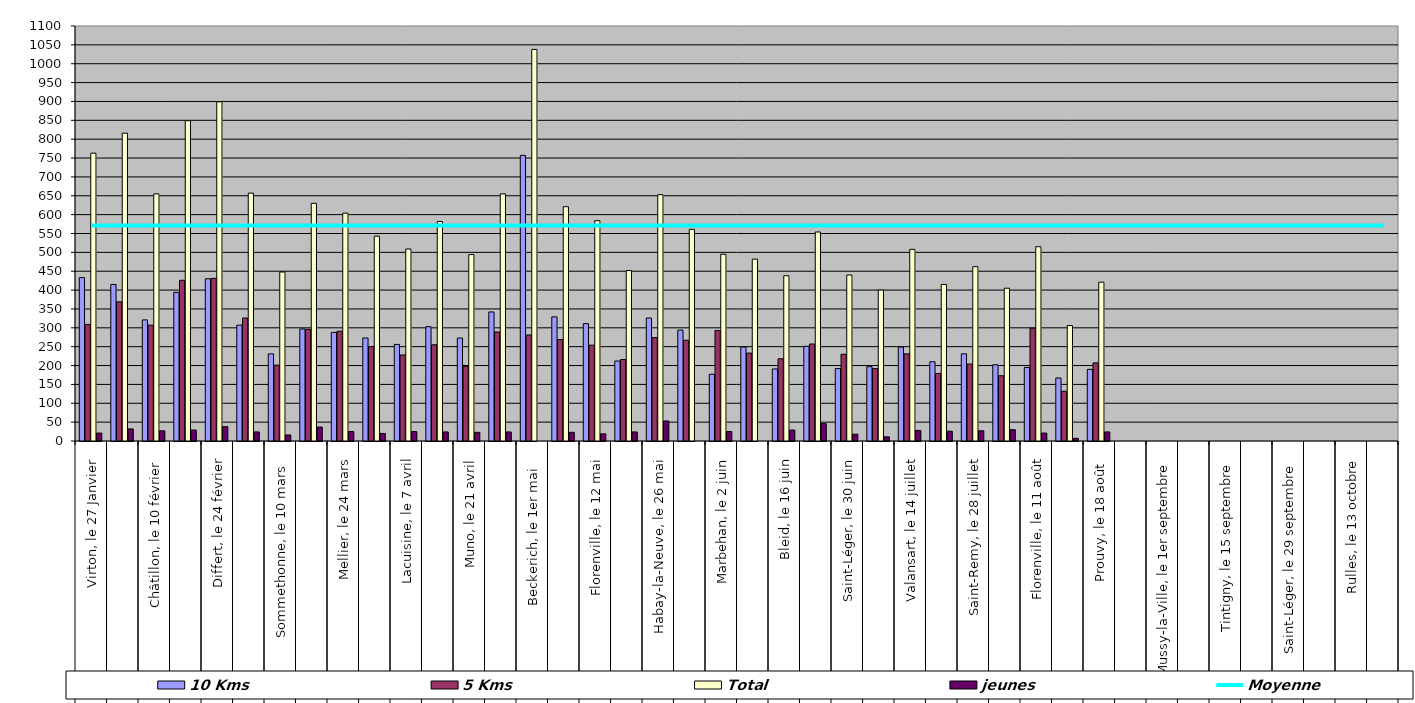
| Category | 10 Kms | 5 Kms | Total | jeunes |
|---|---|---|---|---|
| 0 | 433 | 309 | 763 | 21 |
| 1 | 415 | 369 | 816 | 32 |
| 2 | 321 | 307 | 655 | 27 |
| 3 | 394 | 426 | 849 | 29 |
| 4 | 430 | 431 | 899 | 38 |
| 5 | 307 | 326 | 657 | 24 |
| 6 | 231 | 201 | 448 | 16 |
| 7 | 297 | 296 | 630 | 37 |
| 8 | 288 | 291 | 604 | 25 |
| 9 | 273 | 250 | 543 | 20 |
| 10 | 256 | 228 | 509 | 25 |
| 11 | 303 | 255 | 582 | 24 |
| 12 | 273 | 198 | 494 | 23 |
| 13 | 342 | 289 | 655 | 24 |
| 14 | 757 | 281 | 1038 | 0 |
| 15 | 329 | 269 | 621 | 23 |
| 16 | 311 | 254 | 584 | 19 |
| 17 | 212 | 216 | 452 | 24 |
| 18 | 326 | 274 | 653 | 53 |
| 19 | 294 | 267 | 561 | 0 |
| 20 | 177 | 293 | 495 | 25 |
| 21 | 249 | 233 | 482 | 0 |
| 22 | 191 | 218 | 438 | 29 |
| 23 | 251 | 257 | 554 | 46 |
| 24 | 192 | 230 | 440 | 18 |
| 25 | 197 | 192 | 400 | 11 |
| 26 | 249 | 231 | 508 | 28 |
| 27 | 210 | 179 | 415 | 26 |
| 28 | 231 | 204 | 462 | 27 |
| 29 | 202 | 173 | 405 | 30 |
| 30 | 195 | 299 | 515 | 21 |
| 31 | 167 | 132 | 306 | 7 |
| 32 | 190 | 207 | 421 | 24 |
| 33 | 0 | 0 | 0 | 0 |
| 34 | 0 | 0 | 0 | 0 |
| 35 | 0 | 0 | 0 | 0 |
| 36 | 0 | 0 | 0 | 0 |
| 37 | 0 | 0 | 0 | 0 |
| 38 | 0 | 0 | 0 | 0 |
| 39 | 0 | 0 | 0 | 0 |
| 40 | 0 | 0 | 0 | 0 |
| 41 | 0 | 0 | 0 | 0 |